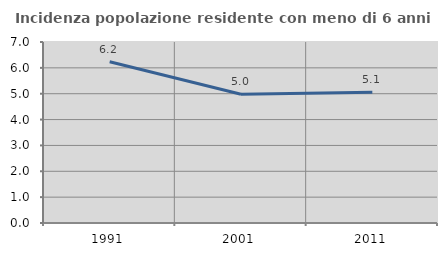
| Category | Incidenza popolazione residente con meno di 6 anni |
|---|---|
| 1991.0 | 6.238 |
| 2001.0 | 4.979 |
| 2011.0 | 5.055 |